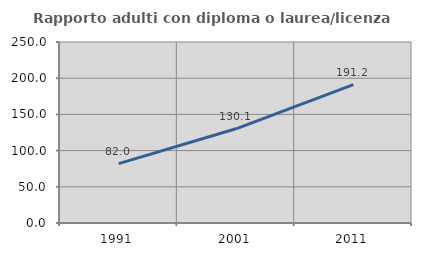
| Category | Rapporto adulti con diploma o laurea/licenza media  |
|---|---|
| 1991.0 | 82.005 |
| 2001.0 | 130.128 |
| 2011.0 | 191.153 |